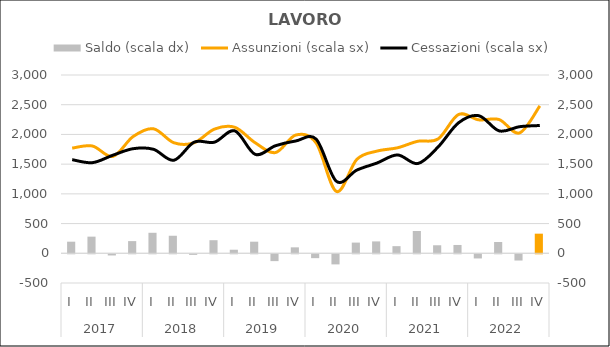
| Category | Saldo (scala dx) |
|---|---|
| 0 | 195 |
| 1 | 280 |
| 2 | -20 |
| 3 | 205 |
| 4 | 345 |
| 5 | 295 |
| 6 | -10 |
| 7 | 220 |
| 8 | 60 |
| 9 | 195 |
| 10 | -115 |
| 11 | 100 |
| 12 | -65 |
| 13 | -170 |
| 14 | 180 |
| 15 | 200 |
| 16 | 120 |
| 17 | 375 |
| 18 | 135 |
| 19 | 140 |
| 20 | -70 |
| 21 | 190 |
| 22 | -105 |
| 23 | 330 |